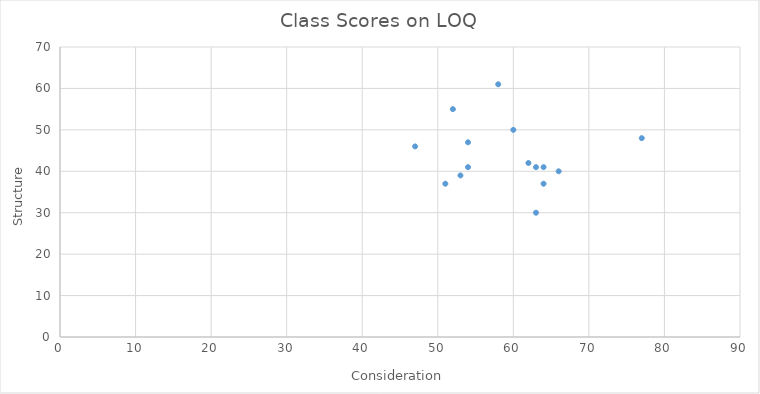
| Category | Structure |
|---|---|
| 77.0 | 48 |
| 63.0 | 30 |
| 52.0 | 55 |
| 62.0 | 42 |
| 58.0 | 61 |
| 60.0 | 50 |
| 64.0 | 37 |
| 63.0 | 41 |
| 64.0 | 41 |
| 54.0 | 41 |
| 66.0 | 40 |
| 53.0 | 39 |
| 54.0 | 47 |
| 51.0 | 37 |
| 47.0 | 46 |